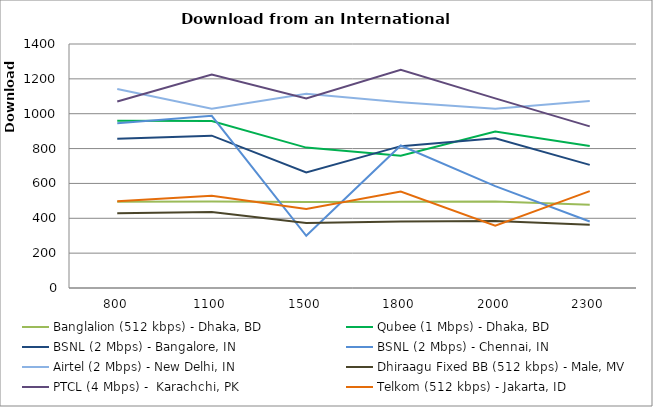
| Category | Banglalion (512 kbps) - Dhaka, BD | Qubee (1 Mbps) - Dhaka, BD | BSNL (2 Mbps) - Bangalore, IN | BSNL (2 Mbps) - Chennai, IN | Airtel (2 Mbps) - New Delhi, IN | Dhiraagu Fixed BB (512 kbps) - Male, MV | PTCL (4 Mbps) -  Karachchi, PK | Telkom (512 kbps) - Jakarta, ID |
|---|---|---|---|---|---|---|---|---|
| 800.0 | 495.5 | 959.75 | 856 | 944.8 | 1141.4 | 428.462 | 1070 | 497.333 |
| 1100.0 | 496 | 958.5 | 874 | 988 | 1028.25 | 436.667 | 1225.286 | 529 |
| 1500.0 | 493 | 805.5 | 663.5 | 299.667 | 1114.25 | 372.692 | 1087.167 | 453.4 |
| 1800.0 | 495.5 | 759.5 | 814 | 817.333 | 1066.25 | 381.462 | 1251.714 | 553.833 |
| 2000.0 | 495.75 | 897.5 | 858.75 | 584.25 | 1028.25 | 384.667 | 1088.167 | 357.5 |
| 2300.0 | 477.5 | 814.5 | 706.25 | 381.25 | 1073.5 | 363.25 | 927.167 | 555.5 |